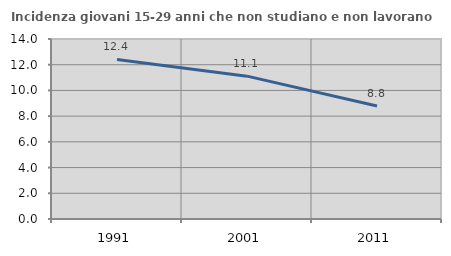
| Category | Incidenza giovani 15-29 anni che non studiano e non lavorano  |
|---|---|
| 1991.0 | 12.409 |
| 2001.0 | 11.111 |
| 2011.0 | 8.791 |